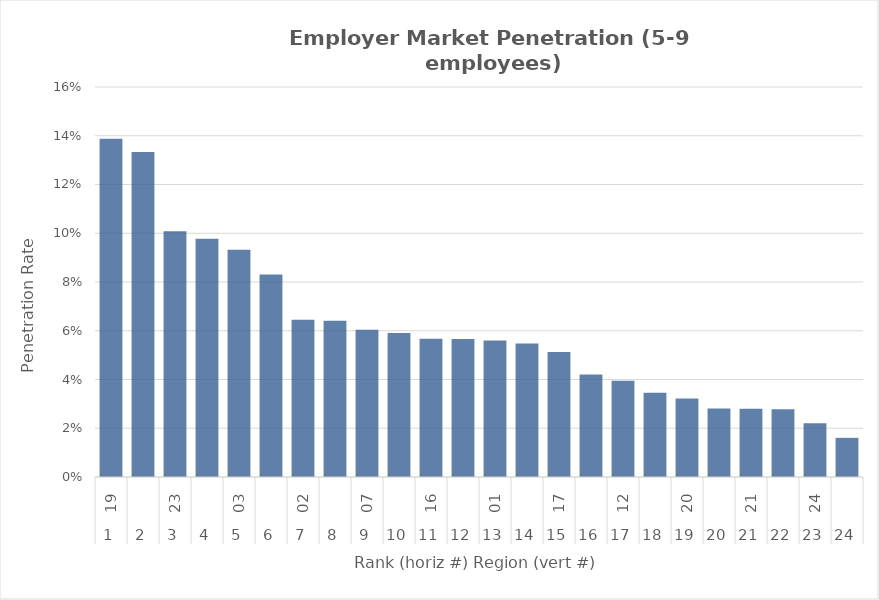
| Category | Rate |
|---|---|
| 0 | 0.139 |
| 1 | 0.133 |
| 2 | 0.101 |
| 3 | 0.098 |
| 4 | 0.093 |
| 5 | 0.083 |
| 6 | 0.065 |
| 7 | 0.064 |
| 8 | 0.06 |
| 9 | 0.059 |
| 10 | 0.057 |
| 11 | 0.057 |
| 12 | 0.056 |
| 13 | 0.055 |
| 14 | 0.051 |
| 15 | 0.042 |
| 16 | 0.039 |
| 17 | 0.035 |
| 18 | 0.032 |
| 19 | 0.028 |
| 20 | 0.028 |
| 21 | 0.028 |
| 22 | 0.022 |
| 23 | 0.016 |